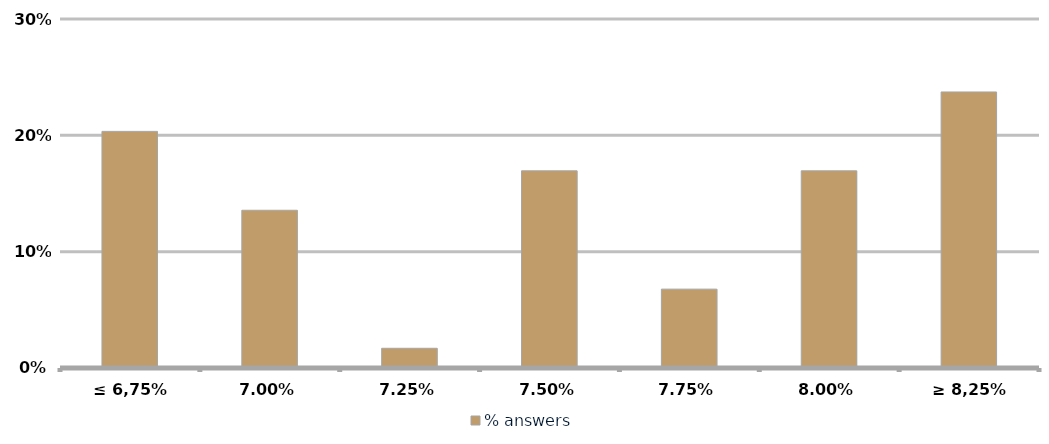
| Category | % answers |
|---|---|
| ≤ 6,75% | 0.203 |
| 7.00% | 0.136 |
| 7.25% | 0.017 |
| 7.50% | 0.169 |
| 7.75% | 0.068 |
| 8.00% | 0.169 |
| ≥ 8,25% | 0.237 |